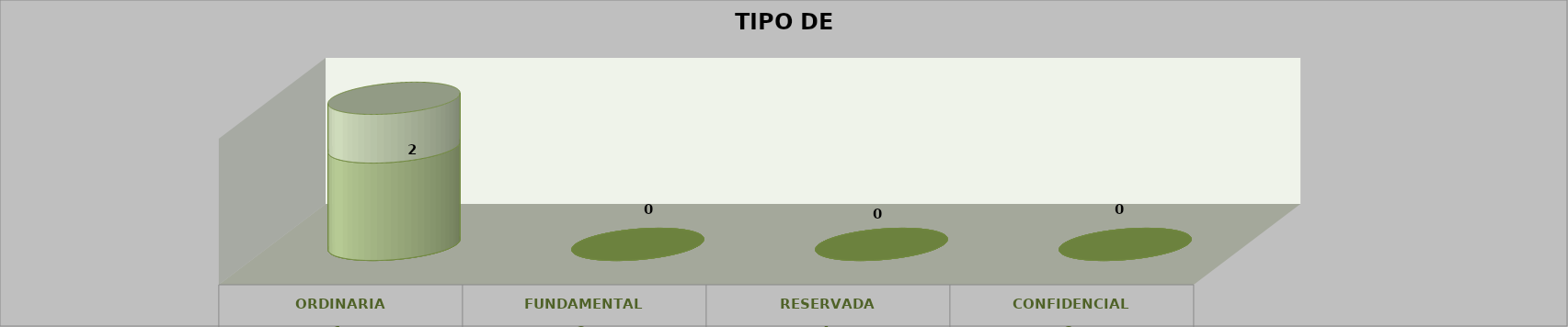
| Category | Series 0 | Series 2 | Series 1 | Series 3 | Series 4 |
|---|---|---|---|---|---|
| 0 |  |  |  | 2 | 1 |
| 1 |  |  |  | 0 | 0 |
| 2 |  |  |  | 0 | 0 |
| 3 |  |  |  | 0 | 0 |